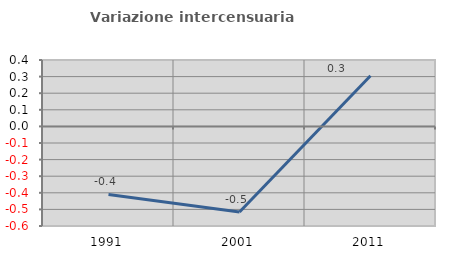
| Category | Variazione intercensuaria annua |
|---|---|
| 1991.0 | -0.41 |
| 2001.0 | -0.516 |
| 2011.0 | 0.306 |